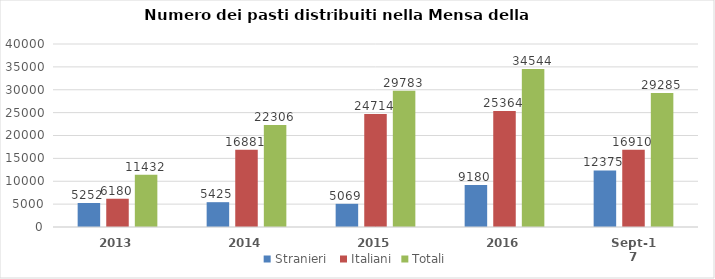
| Category | Stranieri  | Italiani | Totali |
|---|---|---|---|
| 2013.0 | 5252 | 6180 | 11432 |
| 2014.0 | 5425 | 16881 | 22306 |
| 2015.0 | 5069 | 24714 | 29783 |
| 2016.0 | 9180 | 25364 | 34544 |
| 43008.0 | 12375 | 16910 | 29285 |